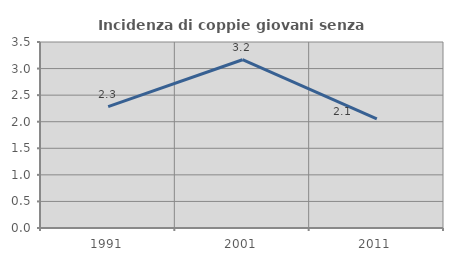
| Category | Incidenza di coppie giovani senza figli |
|---|---|
| 1991.0 | 2.284 |
| 2001.0 | 3.166 |
| 2011.0 | 2.053 |